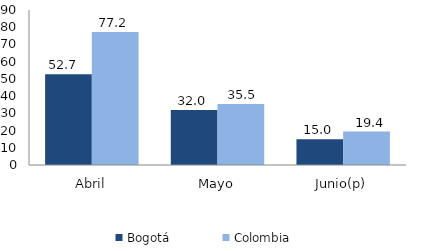
| Category | Bogotá | Colombia |
|---|---|---|
| Abril | 52.67 | 77.222 |
| Mayo | 31.954 | 35.482 |
| Junio(p) | 14.975 | 19.38 |